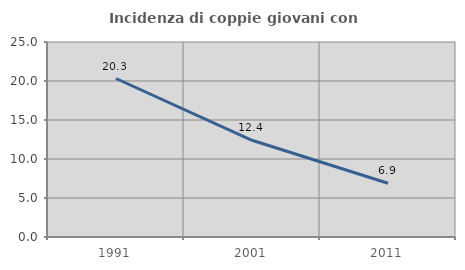
| Category | Incidenza di coppie giovani con figli |
|---|---|
| 1991.0 | 20.32 |
| 2001.0 | 12.401 |
| 2011.0 | 6.889 |